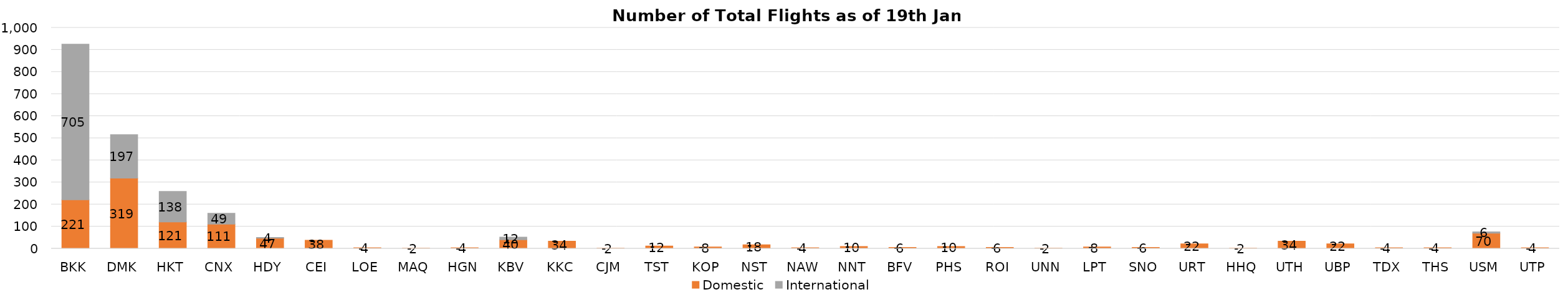
| Category | Domestic | International |
|---|---|---|
| BKK | 221 | 705 |
| DMK | 319 | 197 |
| HKT | 121 | 138 |
| CNX | 111 | 49 |
| HDY | 47 | 4 |
| CEI | 38 | 0 |
| LOE | 4 | 0 |
| MAQ | 2 | 0 |
| HGN | 4 | 0 |
| KBV | 40 | 12 |
| KKC | 34 | 0 |
| CJM | 2 | 0 |
| TST | 12 | 0 |
| KOP | 8 | 0 |
| NST | 18 | 0 |
| NAW | 4 | 0 |
| NNT | 10 | 0 |
| BFV | 6 | 0 |
| PHS | 10 | 0 |
| ROI | 6 | 0 |
| UNN | 2 | 0 |
| LPT | 8 | 0 |
| SNO | 6 | 0 |
| URT | 22 | 0 |
| HHQ | 2 | 0 |
| UTH | 34 | 0 |
| UBP | 22 | 0 |
| TDX | 4 | 0 |
| THS | 4 | 0 |
| USM | 70 | 6 |
| UTP | 4 | 0 |